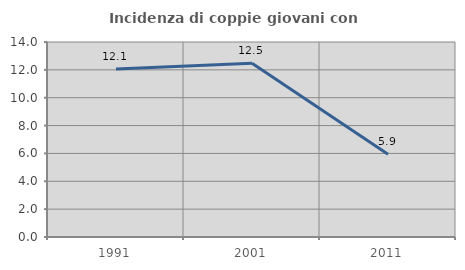
| Category | Incidenza di coppie giovani con figli |
|---|---|
| 1991.0 | 12.069 |
| 2001.0 | 12.469 |
| 2011.0 | 5.943 |